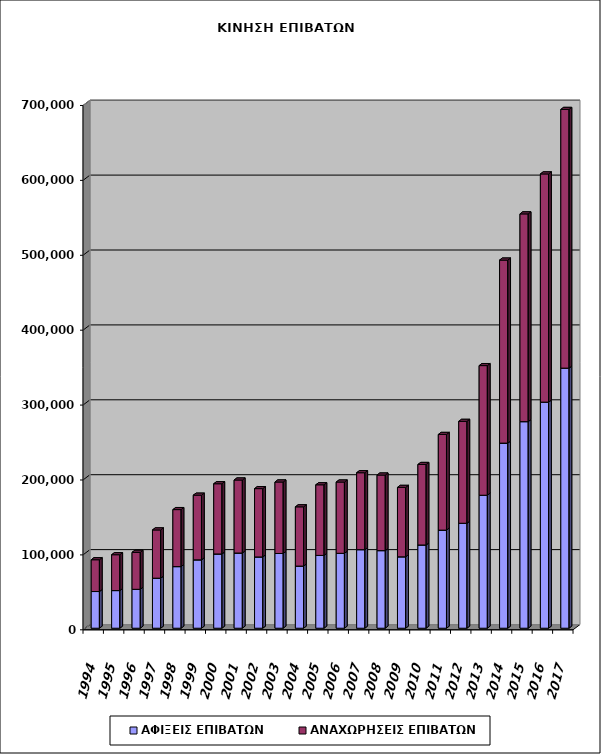
| Category | ΑΦΙΞΕΙΣ ΕΠΙΒΑΤΩΝ | ΑΝΑΧΩΡΗΣΕΙΣ ΕΠΙΒΑΤΩΝ |
|---|---|---|
| 1994.0 | 48990 | 42429 |
| 1995.0 | 50256 | 47864 |
| 1996.0 | 51957 | 49354 |
| 1997.0 | 66803 | 64400 |
| 1998.0 | 82249 | 76116 |
| 1999.0 | 91299 | 86316 |
| 2000.0 | 99132 | 93740 |
| 2001.0 | 100390 | 97474 |
| 2002.0 | 95158 | 91214 |
| 2003.0 | 99758 | 95445 |
| 2004.0 | 82944 | 79099 |
| 2005.0 | 97226 | 94262 |
| 2006.0 | 99999 | 95150 |
| 2007.0 | 104901 | 102697 |
| 2008.0 | 103599 | 100888 |
| 2009.0 | 95332 | 92657 |
| 2010.0 | 111136 | 107467 |
| 2011.0 | 130974 | 127710 |
| 2012.0 | 140131 | 136023 |
| 2013.0 | 177540 | 173070 |
| 2014.0 | 247126 | 244338 |
| 2015.0 | 275812 | 277344 |
| 2016.0 | 301842 | 304659 |
| 2017.0 | 347225 | 345394 |